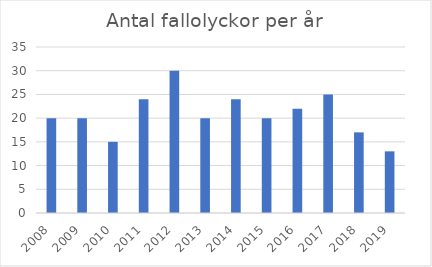
| Category | Antal fallolyckor |
|---|---|
| 2008.0 | 20 |
| 2009.0 | 20 |
| 2010.0 | 15 |
| 2011.0 | 24 |
| 2012.0 | 30 |
| 2013.0 | 20 |
| 2014.0 | 24 |
| 2015.0 | 20 |
| 2016.0 | 22 |
| 2017.0 | 25 |
| 2018.0 | 17 |
| 2019.0 | 13 |